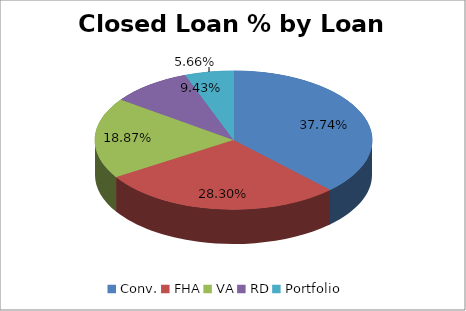
| Category | Closed Loan % (Current Month) |
|---|---|
| Conv. | 0.377 |
| FHA | 0.283 |
| VA | 0.189 |
| RD | 0.094 |
| Portfolio | 0.057 |